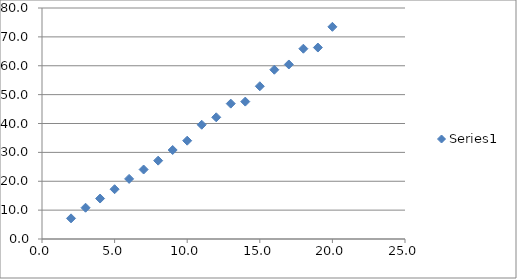
| Category | Series 0 |
|---|---|
| 2.0 | 7.15 |
| 3.0 | 10.828 |
| 4.0 | 14.013 |
| 5.0 | 17.246 |
| 6.0 | 20.817 |
| 7.0 | 24.062 |
| 8.0 | 27.134 |
| 9.0 | 30.821 |
| 10.0 | 34.047 |
| 11.0 | 39.567 |
| 12.0 | 42.146 |
| 13.0 | 46.882 |
| 14.0 | 47.586 |
| 15.0 | 52.899 |
| 16.0 | 58.622 |
| 17.0 | 60.439 |
| 18.0 | 65.902 |
| 19.0 | 66.309 |
| 20.0 | 73.481 |